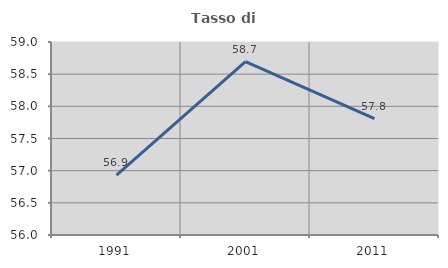
| Category | Tasso di occupazione   |
|---|---|
| 1991.0 | 56.931 |
| 2001.0 | 58.694 |
| 2011.0 | 57.808 |